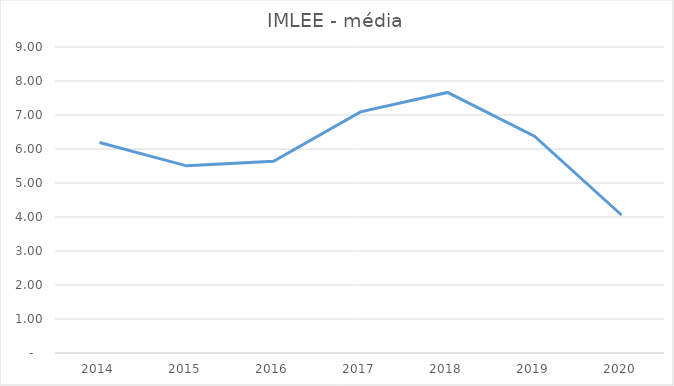
| Category | Series 0 |
|---|---|
| 2014.0 | 6.192 |
| 2015.0 | 5.504 |
| 2016.0 | 5.641 |
| 2017.0 | 7.093 |
| 2018.0 | 7.663 |
| 2019.0 | 6.375 |
| 2020.0 | 4.059 |